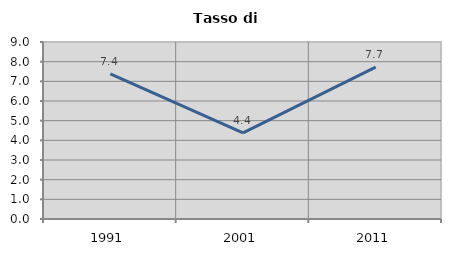
| Category | Tasso di disoccupazione   |
|---|---|
| 1991.0 | 7.374 |
| 2001.0 | 4.377 |
| 2011.0 | 7.722 |